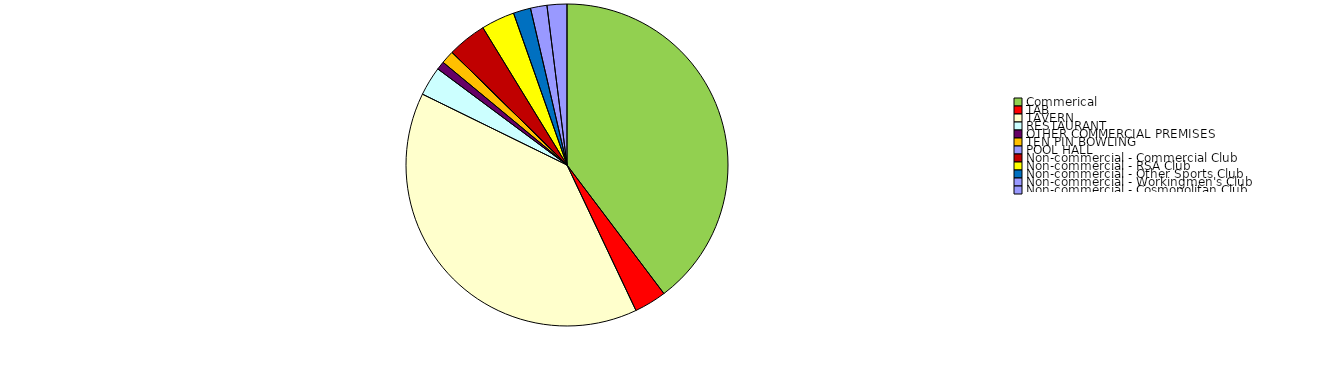
| Category | Series 0 |
|---|---|
| Commerical | 81910782.82 |
| TAB | 6674341.24 |
| TAVERN | 81045853.67 |
| RESTAURANT | 6023493.59 |
| OTHER COMMERCIAL PREMISES | 1728924.08 |
| TEN PIN BOWLING | 2733375.03 |
| POOL HALL | 2156.81 |
| Non-commercial - Commercial Club | 8066852.17 |
| Non-commercial - RSA Club | 6935753.11 |
| Non-commercial - Other Sports Club | 3593530.91 |
| Non-commercial - Workingmen's Club | 3409750.03 |
| Non-commercial - Cosmopolitan Club | 4105919.52 |